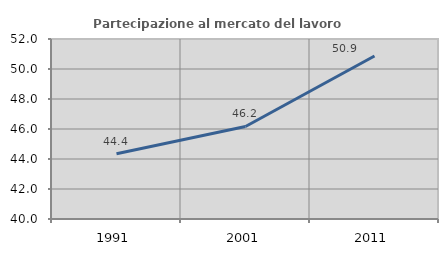
| Category | Partecipazione al mercato del lavoro  femminile |
|---|---|
| 1991.0 | 44.355 |
| 2001.0 | 46.169 |
| 2011.0 | 50.869 |